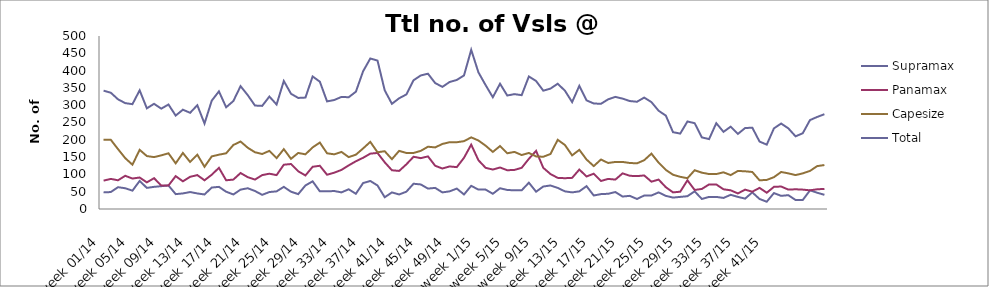
| Category | Supramax | Panamax | Capesize | Total |
|---|---|---|---|---|
| week 01/14 | 48 | 82 | 200 | 342 |
| week 02/14 | 49 | 87 | 200 | 336 |
| week 03/14 | 63 | 83 | 173 | 317 |
| week 04/14 | 60 | 96 | 147 | 306 |
| week 05/14 | 53 | 88 | 128 | 303 |
| week 06/14 | 81 | 91 | 171 | 343 |
| week 07/14 | 61 | 77 | 153 | 291 |
| week 08/14 | 64 | 89 | 150 | 304 |
| week 09/14 | 66 | 68 | 155 | 290 |
| week 10/14 | 68 | 68 | 161 | 302 |
| week 11/14 | 43 | 95 | 132 | 270 |
| week 12/14 | 45 | 80 | 162 | 287 |
| week 13/14 | 49 | 93 | 136 | 278 |
| week 14/14 | 45 | 98 | 157 | 300 |
| week 15/14 | 42 | 83 | 122 | 247 |
| week 16/14 | 62 | 99 | 152 | 313 |
| week 17/14 | 64 | 119 | 157 | 340 |
| week 18/14 | 50 | 83 | 161 | 294 |
| week 19/14 | 42 | 85 | 185 | 312 |
| week 20/14 | 56 | 104 | 195 | 355 |
| week 21/14 | 60 | 92 | 177 | 329 |
| week 22/14 | 52 | 85 | 164 | 299 |
| week 23/14 | 41 | 98 | 159 | 298 |
| week 24/14 | 49 | 102 | 168 | 325 |
| week 25/14 | 51 | 98 | 147 | 302 |
| week 26/14 | 64 | 128 | 173 | 370 |
| week 27/14 | 50 | 130 | 145 | 333 |
| week 28/14 | 43 | 109 | 162 | 321 |
| week 29/14 | 68 | 97 | 158 | 322 |
| week 30/14 | 80 | 122 | 178 | 383 |
| week 31/14 | 51 | 125 | 192 | 368 |
| week 32/14 | 51 | 99 | 161 | 311 |
| week 33/14 | 52 | 105 | 158 | 315 |
| week 34/14 | 48 | 113 | 165 | 324 |
| week 35/14 | 57 | 126 | 150 | 323 |
| week 36/14 | 44 | 138 | 157 | 339 |
| week 37/14 | 75 | 148 | 175 | 398 |
| week 38/14 | 81 | 160 | 194 | 435 |
| week 39/14 | 68 | 162 | 164 | 429 |
| week 40/14 | 34 | 135 | 167 | 343 |
| week 41/14 | 48 | 112 | 144 | 304 |
| week 42/14 | 42 | 110 | 168 | 320 |
| week 43/14 | 50 | 129 | 162 | 331 |
| week 44/14 | 73 | 151 | 162 | 372 |
| week 45/14 | 71 | 147 | 168 | 386 |
| week 46/14 | 59 | 152 | 180 | 391 |
| week 47/14 | 61 | 125 | 178 | 364 |
| week 48/14 | 48 | 117 | 188 | 353 |
| week 49/14 | 51 | 123 | 193 | 367 |
| week 50/14 | 59 | 121 | 193 | 373 |
| week 51/14 | 42 | 148 | 196 | 386 |
| week 52/14 | 67 | 186 | 207 | 460 |
| week 1/15 | 56 | 141 | 198 | 395 |
| week 2/15 | 56 | 119 | 183 | 358 |
| week 3/15 | 44 | 114 | 165 | 323 |
| week 4/15 | 60 | 120 | 182 | 362 |
| week 5/15 | 55 | 112 | 161 | 328 |
| week 6/15 | 54 | 113 | 165 | 332 |
| week 7/15 | 54 | 119 | 156 | 329 |
| week 8/15 | 76 | 145 | 162 | 383 |
| week 9/15 | 50 | 168 | 152 | 370 |
| week 10/15 | 65 | 119 | 151 | 342 |
| week 11/15 | 68 | 101 | 159 | 348 |
| week 12/15 | 61 | 90 | 200 | 362 |
| week 13/15 | 51 | 89 | 185 | 342 |
| week 14/15 | 48 | 90 | 155 | 309 |
| week 15/15 | 51 | 114 | 171 | 356 |
| week 16/15 | 66 | 94 | 143 | 314 |
| week 17/15 | 39 | 102 | 124 | 305 |
| week 18/15 | 43 | 81 | 143 | 304 |
| week 19/15 | 44 | 87 | 133 | 317 |
| week 20/15 | 49 | 85 | 136 | 324 |
| week 21/15 | 36 | 103 | 136 | 319 |
| week 22/15 | 38 | 96 | 133 | 312 |
| week 23/15 | 29 | 95 | 132 | 310 |
| week 24/15 | 39 | 97 | 141 | 322 |
| week 25/15 | 39 | 79 | 160 | 309 |
| week 26/15 | 48 | 85 | 134 | 284 |
| week 27/15 | 38 | 63 | 113 | 270 |
| week 28/15 | 33 | 48 | 99 | 222 |
| week 29/15 | 35 | 50 | 93 | 218 |
| week 30/15 | 37 | 83 | 89 | 253 |
| week 31/15 | 51 | 55 | 112 | 248 |
| week 32/15 | 29 | 58 | 105 | 207 |
| week 33/15 | 35 | 71 | 101 | 202 |
| week 34/15 | 35 | 71 | 101 | 248 |
| week 35/15 | 32 | 57 | 106 | 223 |
| week 36/15 | 41 | 54 | 98 | 238 |
| week 37/15 | 35 | 45 | 110 | 217 |
| week 38/15 | 30 | 56 | 109 | 234 |
| week 39/15 | 48 | 50 | 107 | 235 |
| week 40/15 | 29 | 61 | 83 | 195 |
| week 41/15 | 21 | 47 | 84 | 186 |
| week 42/15 | 46 | 64 | 92 | 233 |